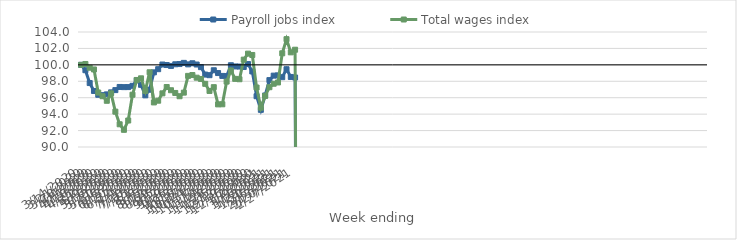
| Category | Payroll jobs index | Total wages index |
|---|---|---|
| 14/03/2020 | 100 | 100 |
| 21/03/2020 | 99.348 | 100.108 |
| 28/03/2020 | 97.784 | 99.651 |
| 04/04/2020 | 96.822 | 99.44 |
| 11/04/2020 | 96.355 | 96.626 |
| 18/04/2020 | 96.313 | 96.179 |
| 25/04/2020 | 96.406 | 95.625 |
| 02/05/2020 | 96.651 | 96.526 |
| 09/05/2020 | 96.928 | 94.302 |
| 16/05/2020 | 97.31 | 92.765 |
| 23/05/2020 | 97.289 | 92.092 |
| 30/05/2020 | 97.295 | 93.223 |
| 06/06/2020 | 97.448 | 96.365 |
| 13/06/2020 | 98.127 | 98.161 |
| 20/06/2020 | 97.57 | 98.361 |
| 27/06/2020 | 96.289 | 96.831 |
| 04/07/2020 | 96.974 | 99.097 |
| 11/07/2020 | 99.087 | 95.426 |
| 18/07/2020 | 99.474 | 95.636 |
| 25/07/2020 | 100.04 | 96.531 |
| 01/08/2020 | 99.979 | 97.302 |
| 08/08/2020 | 99.868 | 96.91 |
| 15/08/2020 | 100.069 | 96.578 |
| 22/08/2020 | 100.097 | 96.179 |
| 29/08/2020 | 100.242 | 96.619 |
| 05/09/2020 | 100.06 | 98.66 |
| 12/09/2020 | 100.195 | 98.761 |
| 19/09/2020 | 100.041 | 98.438 |
| 26/09/2020 | 99.72 | 98.284 |
| 03/10/2020 | 98.816 | 97.689 |
| 10/10/2020 | 98.744 | 96.825 |
| 17/10/2020 | 99.343 | 97.285 |
| 24/10/2020 | 99.002 | 95.188 |
| 31/10/2020 | 98.655 | 95.2 |
| 07/11/2020 | 98.633 | 97.961 |
| 14/11/2020 | 99.954 | 99.315 |
| 21/11/2020 | 99.807 | 98.295 |
| 28/11/2020 | 99.793 | 98.248 |
| 05/12/2020 | 99.743 | 100.637 |
| 12/12/2020 | 100.095 | 101.367 |
| 19/12/2020 | 99.196 | 101.203 |
| 26/12/2020 | 96.181 | 97.241 |
| 02/01/2021 | 94.522 | 94.79 |
| 09/01/2021 | 96.273 | 96.217 |
| 16/01/2021 | 98.141 | 97.278 |
| 23/01/2021 | 98.688 | 97.701 |
| 30/01/2021 | 98.722 | 97.855 |
| 06/02/2021 | 98.5 | 101.406 |
| 13/02/2021 | 99.468 | 103.128 |
| 20/02/2021 | 98.529 | 101.523 |
| 27/02/2021 | 98.462 | 101.843 |